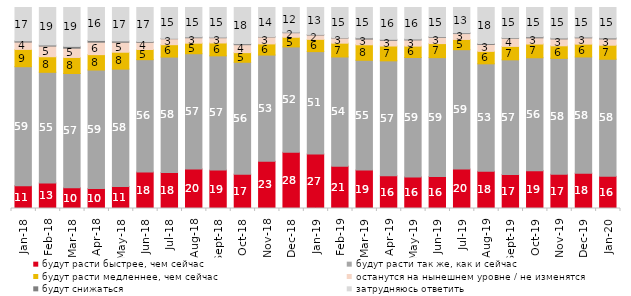
| Category | будут расти быстрее, чем сейчас | будут расти так же, как и сейчас | будут расти медленнее, чем сейчас | останутся на нынешнем уровне / не изменятся | будут снижаться | затрудняюсь ответить |
|---|---|---|---|---|---|---|
| 2018-01-01 | 11.35 | 59.2 | 8.6 | 3.65 | 0.6 | 16.6 |
| 2018-02-01 | 12.7 | 55.05 | 7.75 | 5.3 | 0.55 | 18.65 |
| 2018-03-01 | 10.3 | 56.85 | 8 | 4.6 | 0.9 | 19.35 |
| 2018-04-01 | 9.9 | 59 | 7.65 | 6.2 | 0.85 | 16.4 |
| 2018-05-01 | 10.95 | 58.4 | 8.4 | 4.95 | 0.65 | 16.65 |
| 2018-06-01 | 18.15 | 55.9 | 5.05 | 3.6 | 0.4 | 16.9 |
| 2018-07-01 | 17.85 | 57.5 | 6.15 | 2.95 | 0.2 | 15.35 |
| 2018-08-01 | 19.65 | 57.35 | 5.25 | 2.7 | 0.4 | 14.65 |
| 2018-09-01 | 19.1 | 56.85 | 6.4 | 2.6 | 0.3 | 14.75 |
| 2018-10-01 | 17.1 | 55.65 | 4.8 | 3.95 | 0.5 | 18 |
| 2018-11-01 | 23.453 | 52.894 | 5.539 | 3.443 | 0.2 | 14.471 |
| 2018-12-01 | 27.95 | 52.45 | 4.8 | 2.25 | 0.3 | 12.25 |
| 2019-01-01 | 27.15 | 50.9 | 6.1 | 2.15 | 0.3 | 13.4 |
| 2019-02-01 | 21.05 | 54.35 | 6.85 | 2.55 | 0.2 | 15 |
| 2019-03-01 | 19.095 | 54.649 | 7.708 | 2.834 | 0.597 | 15.117 |
| 2019-04-01 | 16.287 | 57.178 | 7.376 | 2.822 | 0.495 | 15.842 |
| 2019-05-01 | 15.701 | 59.435 | 5.646 | 3.071 | 0.446 | 15.701 |
| 2019-06-01 | 15.86 | 59.202 | 6.983 | 3.092 | 0.349 | 14.514 |
| 2019-07-01 | 19.604 | 59.406 | 5.099 | 2.921 | 0.396 | 12.574 |
| 2019-08-01 | 18.482 | 53.497 | 6.194 | 3.447 | 0.45 | 17.932 |
| 2019-09-01 | 16.881 | 57.079 | 6.683 | 4.01 | 0.297 | 15.05 |
| 2019-10-01 | 18.762 | 56.238 | 6.832 | 3.069 | 0.545 | 14.554 |
| 2019-11-01 | 17.03 | 57.673 | 6.238 | 3.416 | 0.446 | 15.198 |
| 2019-12-01 | 17.574 | 57.822 | 6.386 | 3.119 | 0.396 | 14.703 |
| 2020-01-01 | 15.99 | 58.267 | 6.98 | 3.119 | 0.495 | 15.149 |